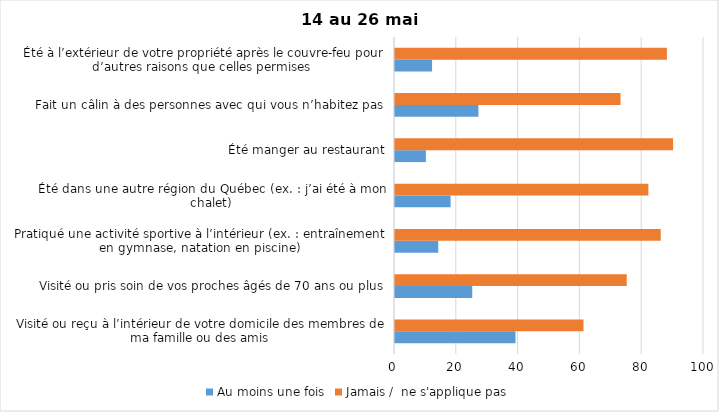
| Category | Au moins une fois | Jamais /  ne s'applique pas |
|---|---|---|
| Visité ou reçu à l’intérieur de votre domicile des membres de ma famille ou des amis | 39 | 61 |
| Visité ou pris soin de vos proches âgés de 70 ans ou plus | 25 | 75 |
| Pratiqué une activité sportive à l’intérieur (ex. : entraînement en gymnase, natation en piscine) | 14 | 86 |
| Été dans une autre région du Québec (ex. : j’ai été à mon chalet) | 18 | 82 |
| Été manger au restaurant | 10 | 90 |
| Fait un câlin à des personnes avec qui vous n’habitez pas | 27 | 73 |
| Été à l’extérieur de votre propriété après le couvre-feu pour d’autres raisons que celles permises  | 12 | 88 |